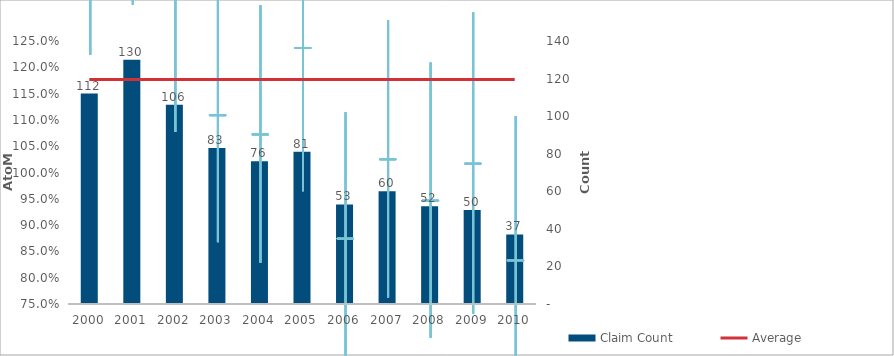
| Category | Claim Count |
|---|---|
| 0 | 112 |
| 1 | 130 |
| 2 | 106 |
| 3 | 83 |
| 4 | 76 |
| 5 | 81 |
| 6 | 53 |
| 7 | 60 |
| 8 | 52 |
| 9 | 50 |
| 10 | 37 |